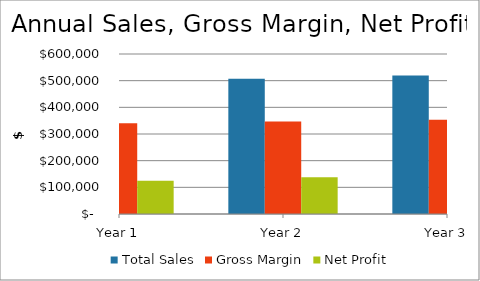
| Category | Total Sales | Gross Margin | Net Profit |
|---|---|---|---|
| Year 1 | 495024.395 | 340512.624 | 124419.598 |
| Year 2 | 507042.614 | 346897.635 | 137706.872 |
| Year 3 | 519352.613 | 353404.351 | 150816.005 |